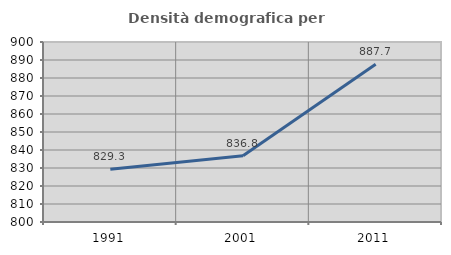
| Category | Densità demografica |
|---|---|
| 1991.0 | 829.323 |
| 2001.0 | 836.823 |
| 2011.0 | 887.695 |